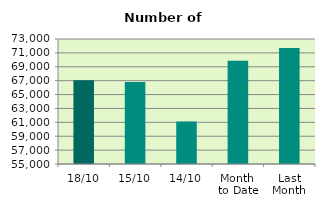
| Category | Series 0 |
|---|---|
| 18/10 | 67046 |
| 15/10 | 66816 |
| 14/10 | 61136 |
| Month 
to Date | 69884.833 |
| Last
Month | 71692 |